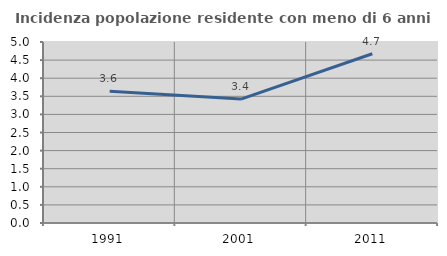
| Category | Incidenza popolazione residente con meno di 6 anni |
|---|---|
| 1991.0 | 3.642 |
| 2001.0 | 3.423 |
| 2011.0 | 4.676 |